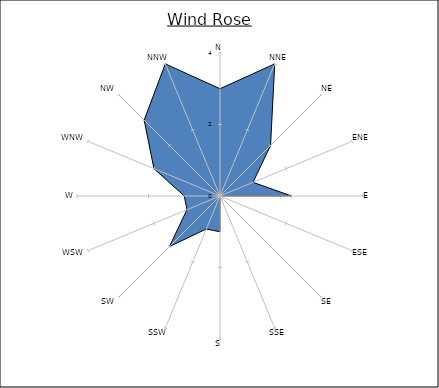
| Category | Series 0 |
|---|---|
| N | 3 |
| NNE | 4 |
| NE | 2 |
| ENE | 1 |
| E | 2 |
| ESE | 0 |
| SE | 3 |
| SSE | 0 |
| S | 1 |
| SSW | 1 |
| SW | 2 |
| WSW | 1 |
| W | 1 |
| WNW | 2 |
| NW | 3 |
| NNW | 4 |